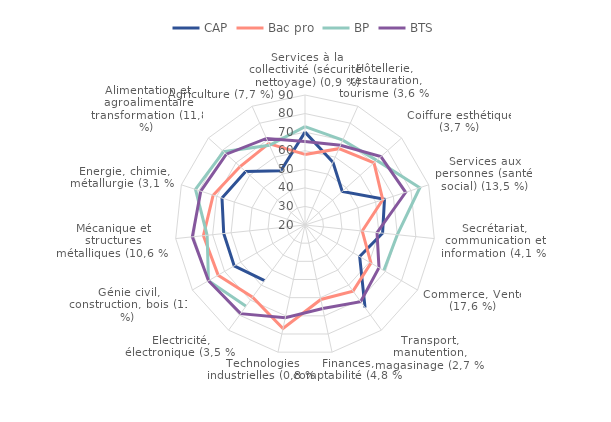
| Category | CAP | Bac pro | BP | BTS |
|---|---|---|---|---|
| Services à la collectivité (sécurité, nettoyage) (0,9 %) | 70 | 58 | 73 | 65 |
| Hôtellerie, restauration, tourisme (3,6 %) | 57 | 65 | 70 | 67 |
| Coiffure esthétique (3,7 %) | 47 | 70 | 72 | 75 |
| Services aux personnes (santé, social) (13,5 %) | 65 | 64 | 85 | 77 |
| Secrétariat, communication et information (4,1 %) | 62 | 51 | 70 | 59 |
| Commerce, Vente (17,6 %) | 54 | 61 | 69 | 66 |
| Transport, manutention, magasinage (2,7 %) | 75 | 64 | 0 | 71 |
| Finances, comptabilité (4,8 %) | 0 | 61 | 0 | 66 |
| Technologies industrielles (0,8 %) | 0 | 77 | 0 | 71 |
| Electricité, électronique (3,5 %) | 57 | 68 | 74 | 79 |
| Génie civil, construction, bois (11 %) | 64 | 74 | 80 | 80 |
| Mécanique et structures métalliques (10,6 %) | 64 | 75 | 73 | 81 |
| Energie, chimie, métallurgie (3,1 %) | 67 | 72 | 82 | 79 |
| Alimentation et agroalimentaire transformation (11,8 %) | 63 | 67 | 79 | 77 |
| Agriculture (7,7 %) | 52 | 68 | 67 | 71 |